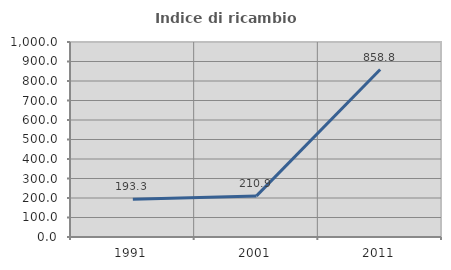
| Category | Indice di ricambio occupazionale  |
|---|---|
| 1991.0 | 193.333 |
| 2001.0 | 210.87 |
| 2011.0 | 858.824 |